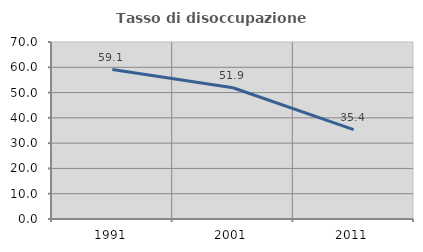
| Category | Tasso di disoccupazione giovanile  |
|---|---|
| 1991.0 | 59.082 |
| 2001.0 | 51.917 |
| 2011.0 | 35.377 |